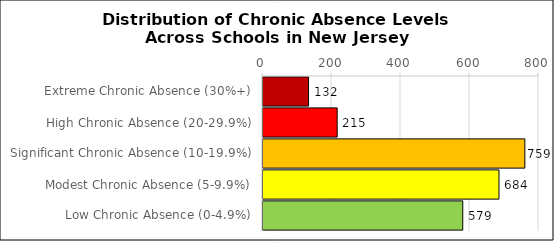
| Category | Number of Schools |
|---|---|
| Extreme Chronic Absence (30%+) | 132 |
| High Chronic Absence (20-29.9%) | 215 |
| Significant Chronic Absence (10-19.9%) | 759 |
| Modest Chronic Absence (5-9.9%) | 684 |
| Low Chronic Absence (0-4.9%) | 579 |